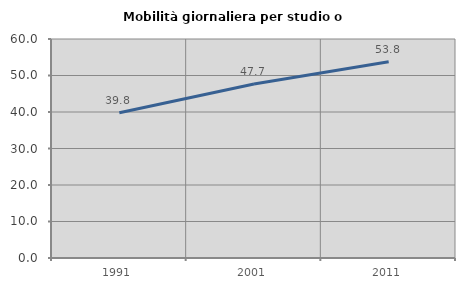
| Category | Mobilità giornaliera per studio o lavoro |
|---|---|
| 1991.0 | 39.8 |
| 2001.0 | 47.652 |
| 2011.0 | 53.762 |